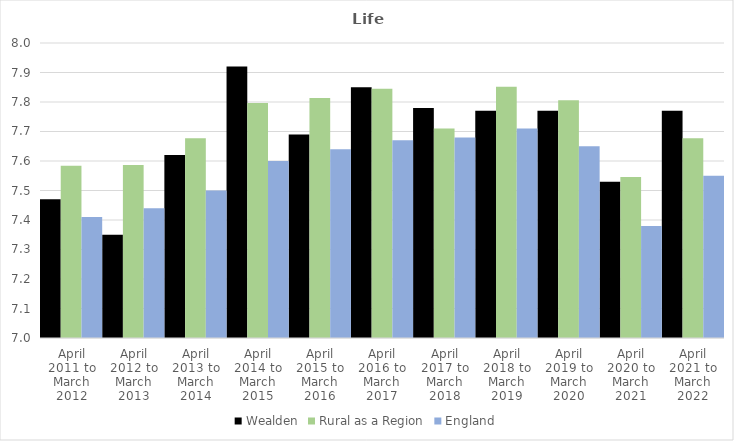
| Category | Wealden | Rural as a Region | England |
|---|---|---|---|
| April 2011 to March 2012 | 7.47 | 7.584 | 7.41 |
| April 2012 to March 2013 | 7.35 | 7.586 | 7.44 |
| April 2013 to March 2014 | 7.62 | 7.677 | 7.5 |
| April 2014 to March 2015 | 7.92 | 7.797 | 7.6 |
| April 2015 to March 2016 | 7.69 | 7.813 | 7.64 |
| April 2016 to March 2017 | 7.85 | 7.845 | 7.67 |
| April 2017 to March 2018 | 7.78 | 7.71 | 7.68 |
| April 2018 to March 2019 | 7.77 | 7.852 | 7.71 |
| April 2019 to March 2020 | 7.77 | 7.806 | 7.65 |
| April 2020 to March 2021 | 7.53 | 7.546 | 7.38 |
| April 2021 to March 2022 | 7.77 | 7.677 | 7.55 |